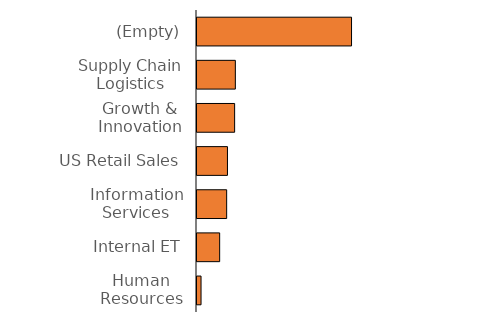
| Category | Nachfrage |
|---|---|
| (Empty) | 193987 |
| Supply Chain Logistics | 48135 |
| Growth & Innovation | 47243 |
| US Retail Sales | 38245 |
| Information Services | 37245 |
| Internal ET | 28456 |
| Human Resources | 5072 |